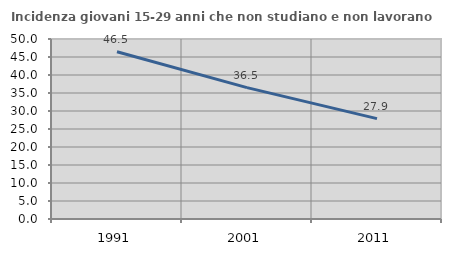
| Category | Incidenza giovani 15-29 anni che non studiano e non lavorano  |
|---|---|
| 1991.0 | 46.46 |
| 2001.0 | 36.492 |
| 2011.0 | 27.876 |